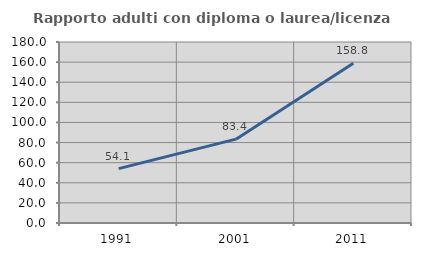
| Category | Rapporto adulti con diploma o laurea/licenza media  |
|---|---|
| 1991.0 | 54.104 |
| 2001.0 | 83.376 |
| 2011.0 | 158.841 |